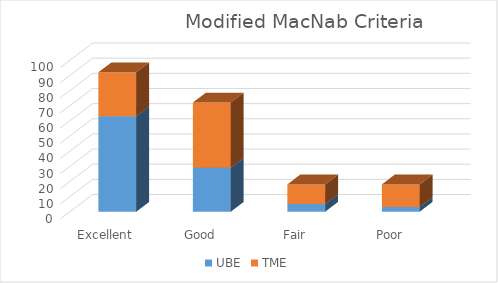
| Category | UBE | TME |
|---|---|---|
| Excellent | 63 | 29 |
| Good | 29 | 43 |
| Fair | 5 | 13 |
| Poor | 3 | 15 |